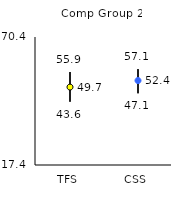
| Category | 25th | 75th | Mean |
|---|---|---|---|
| TFS | 43.6 | 55.9 | 49.67 |
| CSS | 47.1 | 57.1 | 52.37 |